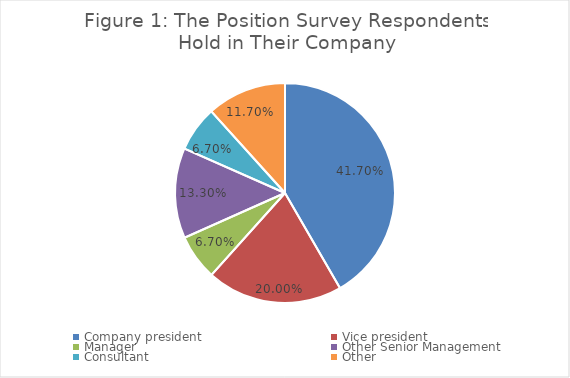
| Category | Series 0 |
|---|---|
| Company president | 0.417 |
| Vice president | 0.2 |
| Manager | 0.067 |
| Other Senior Management | 0.133 |
| Consultant | 0.067 |
| Other | 0.117 |